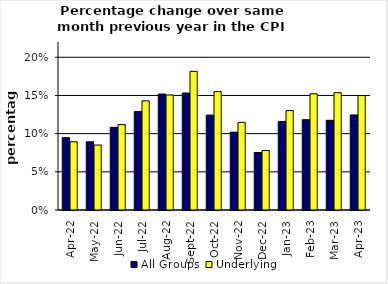
| Category | All Groups | Underlying |
|---|---|---|
| 2022-04-01 | 0.095 | 0.089 |
| 2022-05-01 | 0.089 | 0.085 |
| 2022-06-01 | 0.108 | 0.112 |
| 2022-07-01 | 0.129 | 0.143 |
| 2022-08-01 | 0.152 | 0.151 |
| 2022-09-01 | 0.153 | 0.182 |
| 2022-10-01 | 0.124 | 0.155 |
| 2022-11-01 | 0.102 | 0.115 |
| 2022-12-01 | 0.075 | 0.078 |
| 2023-01-01 | 0.116 | 0.13 |
| 2023-02-01 | 0.118 | 0.152 |
| 2023-03-01 | 0.117 | 0.154 |
| 2023-04-01 | 0.124 | 0.15 |